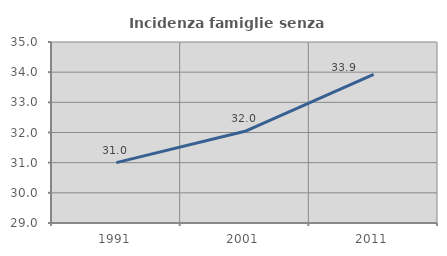
| Category | Incidenza famiglie senza nuclei |
|---|---|
| 1991.0 | 31 |
| 2001.0 | 32.039 |
| 2011.0 | 33.929 |